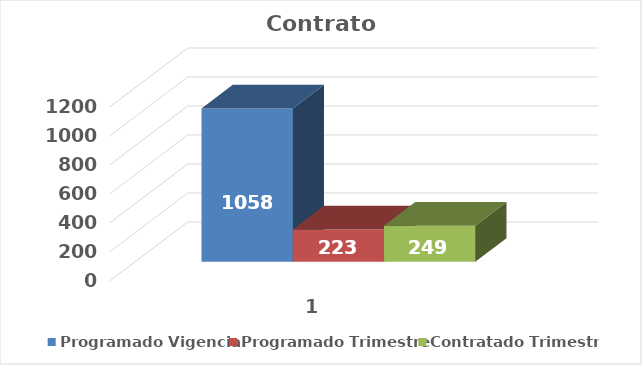
| Category | Programado Vigencia | Programado Trimestre | Contratado Trimestre |
|---|---|---|---|
| 0 | 1058 | 223 | 249 |